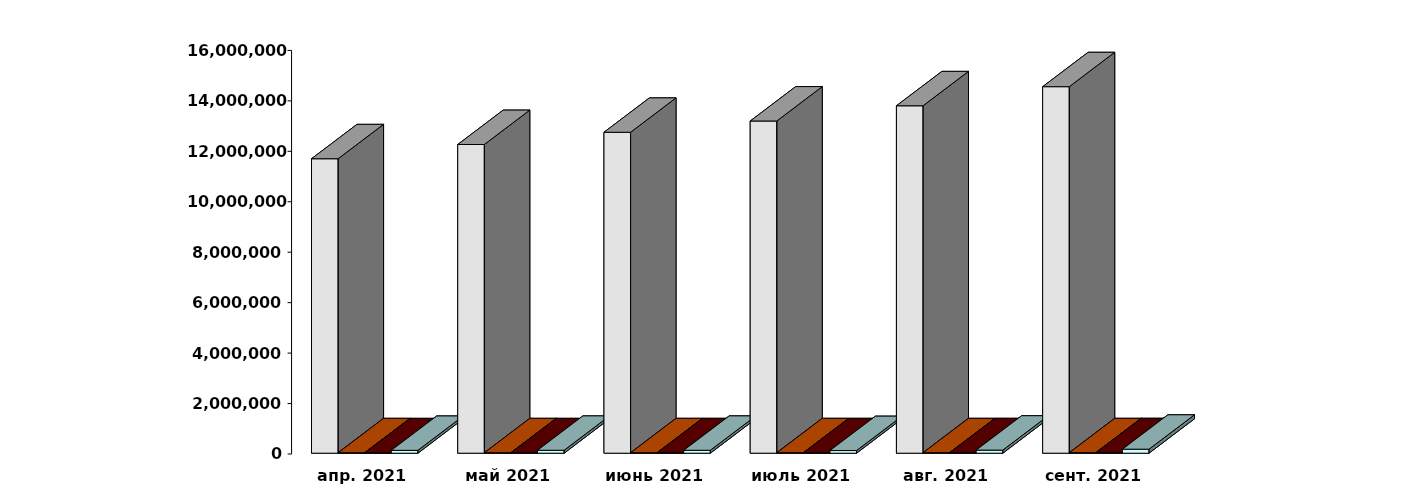
| Category | Физические лица | Юридические лица | Иностранные лица | Клиенты, передавшие свои средства в ДУ |
|---|---|---|---|---|
| 2021-04-30 | 11673527 | 19474 | 18437 | 113270 |
| 2021-05-30 | 12238639 | 19619 | 18804 | 116061 |
| 2021-06-30 | 12722884 | 19751 | 19280 | 115649 |
| 2021-07-30 | 13169586 | 19875 | 19720 | 105728 |
| 2021-08-30 | 13773190 | 19995 | 20283 | 122307 |
| 2021-09-30 | 14530193 | 20081 | 21060 | 158895 |